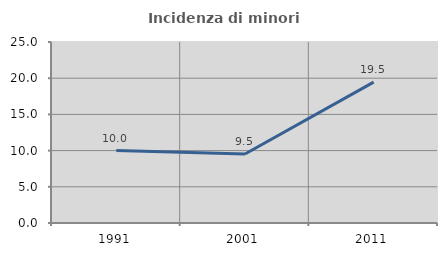
| Category | Incidenza di minori stranieri |
|---|---|
| 1991.0 | 10 |
| 2001.0 | 9.524 |
| 2011.0 | 19.463 |